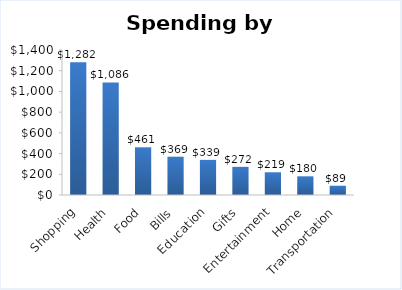
| Category | Final Amount |
|---|---|
| Shopping | 1281.79 |
| Health | 1086.26 |
| Food | 460.58 |
| Bills | 369.32 |
| Education | 338.93 |
| Gifts | 271.58 |
| Entertainment | 219.44 |
| Home | 180.32 |
| Transportation | 89.08 |